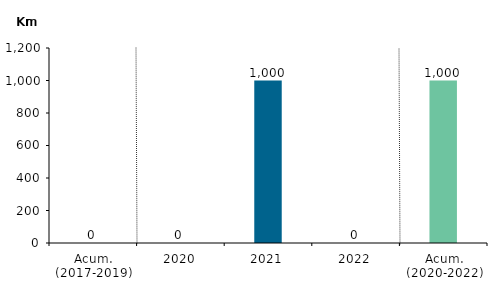
| Category | Series 0 |
|---|---|
| Acum. (2017-2019) | 0 |
| 2020 | 0 |
| 2021 | 1000 |
| 2022 | 0 |
| Acum. (2020-2022) | 1000 |